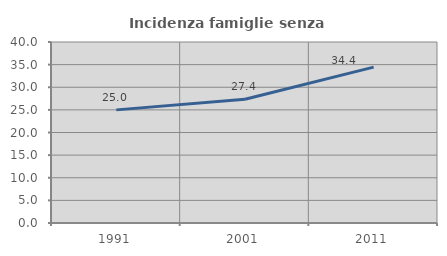
| Category | Incidenza famiglie senza nuclei |
|---|---|
| 1991.0 | 25 |
| 2001.0 | 27.357 |
| 2011.0 | 34.439 |